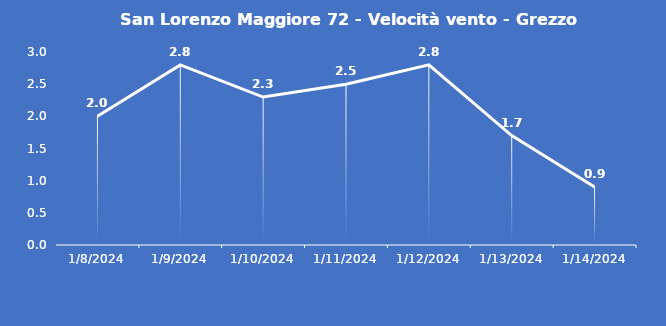
| Category | San Lorenzo Maggiore 72 - Velocità vento - Grezzo (m/s) |
|---|---|
| 1/8/24 | 2 |
| 1/9/24 | 2.8 |
| 1/10/24 | 2.3 |
| 1/11/24 | 2.5 |
| 1/12/24 | 2.8 |
| 1/13/24 | 1.7 |
| 1/14/24 | 0.9 |